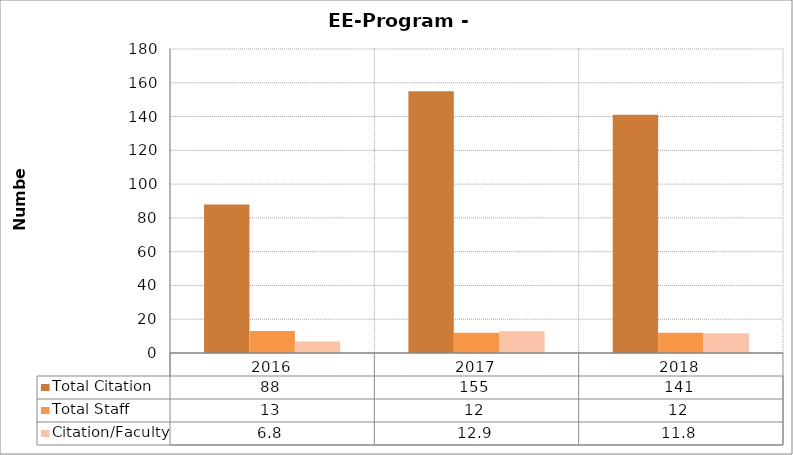
| Category | Total Citation  | Total Staff | Citation/Faculty |
|---|---|---|---|
| 2016.0 | 88 | 13 | 6.769 |
| 2017.0 | 155 | 12 | 12.917 |
| 2018.0 | 141 | 12 | 11.75 |